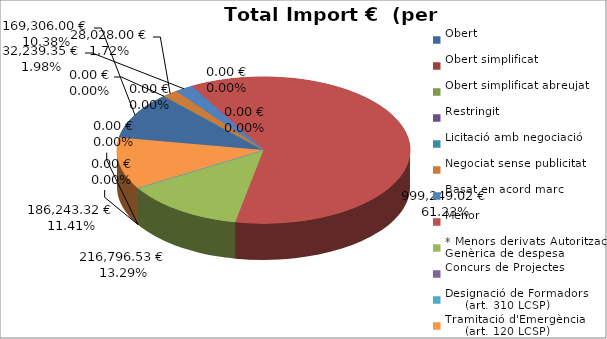
| Category | Total preu
(amb IVA) |
|---|---|
| Obert | 169306 |
| Obert simplificat | 0 |
| Obert simplificat abreujat | 0 |
| Restringit | 0 |
| Licitació amb negociació | 0 |
| Negociat sense publicitat | 28028 |
| Basat en acord marc | 32239.35 |
| Menor | 999249.02 |
| * Menors derivats Autorització Genèrica de despesa | 216796.53 |
| Concurs de Projectes | 0 |
| Designació de Formadors
     (art. 310 LCSP) | 0 |
| Tramitació d'Emergència
     (art. 120 LCSP) | 186243.32 |